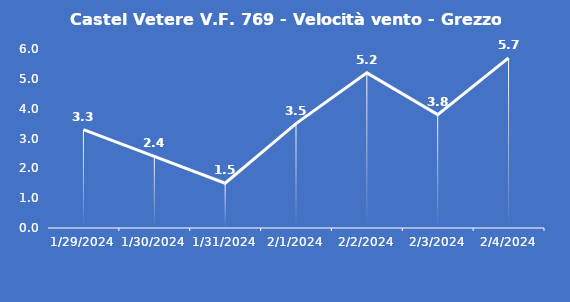
| Category | Castel Vetere V.F. 769 - Velocità vento - Grezzo (m/s) |
|---|---|
| 1/29/24 | 3.3 |
| 1/30/24 | 2.4 |
| 1/31/24 | 1.5 |
| 2/1/24 | 3.5 |
| 2/2/24 | 5.2 |
| 2/3/24 | 3.8 |
| 2/4/24 | 5.7 |